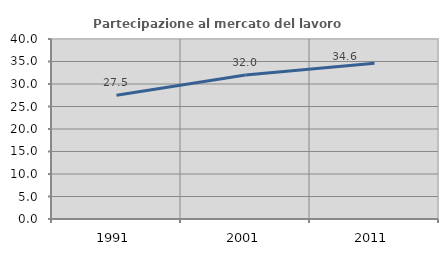
| Category | Partecipazione al mercato del lavoro  femminile |
|---|---|
| 1991.0 | 27.49 |
| 2001.0 | 31.98 |
| 2011.0 | 34.595 |